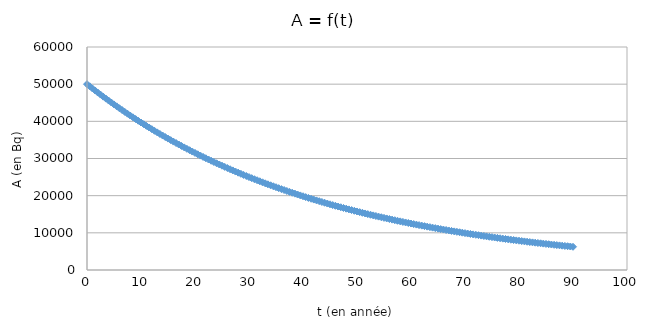
| Category | Series 0 |
|---|---|
| 0.0 | 50000 |
| 0.5 | 49425.701 |
| 1.0 | 48857.998 |
| 1.5 | 48296.816 |
| 2.0 | 47742.08 |
| 2.5 | 47193.716 |
| 3.0 | 46651.65 |
| 3.5 | 46115.81 |
| 4.0 | 45586.124 |
| 4.5 | 45062.523 |
| 5.0 | 44544.936 |
| 5.5 | 44033.294 |
| 6.0 | 43527.528 |
| 6.5 | 43027.572 |
| 7.0 | 42533.358 |
| 7.5 | 42044.821 |
| 8.0 | 41561.895 |
| 8.5 | 41084.516 |
| 9.0 | 40612.62 |
| 9.5 | 40146.144 |
| 10.0 | 39685.026 |
| 10.5 | 39229.205 |
| 11.0 | 38778.619 |
| 11.5 | 38333.209 |
| 12.0 | 37892.914 |
| 12.5 | 37457.677 |
| 13.0 | 37027.439 |
| 13.5 | 36602.142 |
| 14.0 | 36181.731 |
| 14.5 | 35766.148 |
| 15.0 | 35355.339 |
| 15.5 | 34949.248 |
| 16.0 | 34547.822 |
| 16.5 | 34151.006 |
| 17.0 | 33758.749 |
| 17.5 | 33370.996 |
| 18.0 | 32987.698 |
| 18.5 | 32608.802 |
| 19.0 | 32234.258 |
| 19.5 | 31864.016 |
| 20.0 | 31498.026 |
| 20.5 | 31136.241 |
| 21.0 | 30778.61 |
| 21.5 | 30425.088 |
| 22.0 | 30075.626 |
| 22.5 | 29730.178 |
| 23.0 | 29388.698 |
| 23.5 | 29051.14 |
| 24.0 | 28717.459 |
| 24.5 | 28387.611 |
| 25.0 | 28061.551 |
| 25.5 | 27739.237 |
| 26.0 | 27420.624 |
| 26.5 | 27105.672 |
| 27.0 | 26794.337 |
| 27.5 | 26486.577 |
| 28.0 | 26182.353 |
| 28.5 | 25881.623 |
| 29.0 | 25584.347 |
| 29.5 | 25290.486 |
| 30.0 | 25000 |
| 30.5 | 24712.851 |
| 31.0 | 24428.999 |
| 31.5 | 24148.408 |
| 32.0 | 23871.04 |
| 32.5 | 23596.858 |
| 33.0 | 23325.825 |
| 33.5 | 23057.905 |
| 34.0 | 22793.062 |
| 34.5 | 22531.262 |
| 35.0 | 22272.468 |
| 35.5 | 22016.647 |
| 36.0 | 21763.764 |
| 36.5 | 21513.786 |
| 37.0 | 21266.679 |
| 37.5 | 21022.41 |
| 38.0 | 20780.947 |
| 38.5 | 20542.258 |
| 39.0 | 20306.31 |
| 39.5 | 20073.072 |
| 40.0 | 19842.513 |
| 40.5 | 19614.602 |
| 41.0 | 19389.31 |
| 41.5 | 19166.604 |
| 42.0 | 18946.457 |
| 42.5 | 18728.838 |
| 43.0 | 18513.719 |
| 43.5 | 18301.071 |
| 44.0 | 18090.865 |
| 44.5 | 17883.074 |
| 45.0 | 17677.67 |
| 45.5 | 17474.624 |
| 46.0 | 17273.911 |
| 46.5 | 17075.503 |
| 47.0 | 16879.374 |
| 47.5 | 16685.498 |
| 48.0 | 16493.849 |
| 48.5 | 16304.401 |
| 49.0 | 16117.129 |
| 49.5 | 15932.008 |
| 50.0 | 15749.013 |
| 50.5 | 15568.12 |
| 51.0 | 15389.305 |
| 51.5 | 15212.544 |
| 52.0 | 15037.813 |
| 52.5 | 14865.089 |
| 53.0 | 14694.349 |
| 53.5 | 14525.57 |
| 54.0 | 14358.729 |
| 54.5 | 14193.805 |
| 55.0 | 14030.776 |
| 55.5 | 13869.618 |
| 56.0 | 13710.312 |
| 56.5 | 13552.836 |
| 57.0 | 13397.168 |
| 57.5 | 13243.289 |
| 58.0 | 13091.177 |
| 58.5 | 12940.812 |
| 59.0 | 12792.174 |
| 59.5 | 12645.243 |
| 60.0 | 12500 |
| 60.5 | 12356.425 |
| 61.0 | 12214.5 |
| 61.5 | 12074.204 |
| 62.0 | 11935.52 |
| 62.5 | 11798.429 |
| 63.0 | 11662.912 |
| 63.5 | 11528.952 |
| 64.0 | 11396.531 |
| 64.5 | 11265.631 |
| 65.0 | 11136.234 |
| 65.5 | 11008.323 |
| 66.0 | 10881.882 |
| 66.5 | 10756.893 |
| 67.0 | 10633.34 |
| 67.5 | 10511.205 |
| 68.0 | 10390.474 |
| 68.5 | 10271.129 |
| 69.0 | 10153.155 |
| 69.5 | 10036.536 |
| 70.0 | 9921.257 |
| 70.5 | 9807.301 |
| 71.0 | 9694.655 |
| 71.5 | 9583.302 |
| 72.0 | 9473.229 |
| 72.5 | 9364.419 |
| 73.0 | 9256.86 |
| 73.5 | 9150.536 |
| 74.0 | 9045.433 |
| 74.5 | 8941.537 |
| 75.0 | 8838.835 |
| 75.5 | 8737.312 |
| 76.0 | 8636.955 |
| 76.5 | 8537.752 |
| 77.0 | 8439.687 |
| 77.5 | 8342.749 |
| 78.0 | 8246.924 |
| 78.5 | 8152.2 |
| 79.0 | 8058.564 |
| 79.5 | 7966.004 |
| 80.0 | 7874.507 |
| 80.5 | 7784.06 |
| 81.0 | 7694.653 |
| 81.5 | 7606.272 |
| 82.0 | 7518.906 |
| 82.5 | 7432.544 |
| 83.0 | 7347.174 |
| 83.5 | 7262.785 |
| 84.0 | 7179.365 |
| 84.5 | 7096.903 |
| 85.0 | 7015.388 |
| 85.5 | 6934.809 |
| 86.0 | 6855.156 |
| 86.5 | 6776.418 |
| 87.0 | 6698.584 |
| 87.5 | 6621.644 |
| 88.0 | 6545.588 |
| 88.5 | 6470.406 |
| 89.0 | 6396.087 |
| 89.5 | 6322.622 |
| 90.0 | 6250 |